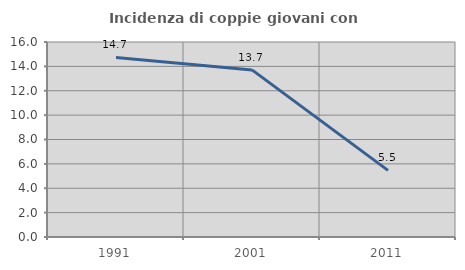
| Category | Incidenza di coppie giovani con figli |
|---|---|
| 1991.0 | 14.729 |
| 2001.0 | 13.71 |
| 2011.0 | 5.469 |